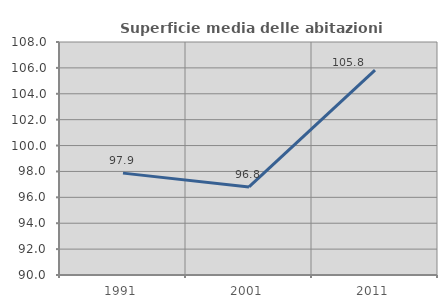
| Category | Superficie media delle abitazioni occupate |
|---|---|
| 1991.0 | 97.871 |
| 2001.0 | 96.8 |
| 2011.0 | 105.821 |